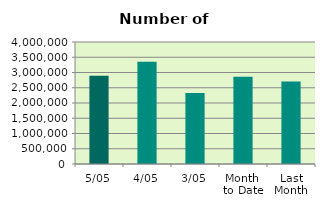
| Category | Series 0 |
|---|---|
| 5/05 | 2890118 |
| 4/05 | 3356296 |
| 3/05 | 2323984 |
| Month 
to Date | 2856799.333 |
| Last
Month | 2707305.9 |